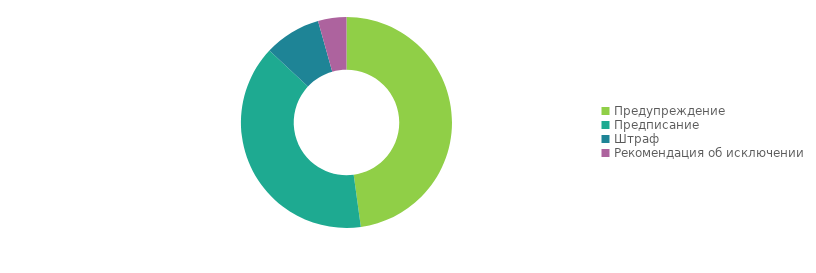
| Category | Series 0 |
|---|---|
| Предупреждение | 11 |
| Предписание | 9 |
| Штраф | 2 |
| Рекомендация об исключении | 1 |